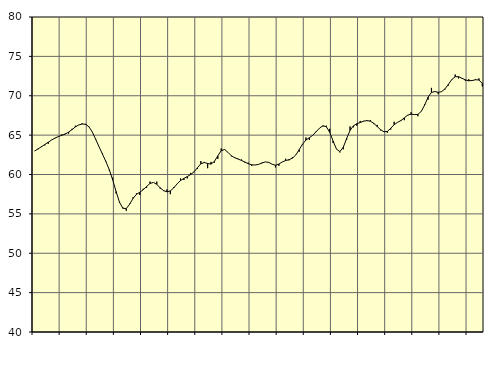
| Category | Piggar | Samtliga anställda (inkl. anställda utomlands) |
|---|---|---|
| nan | 63 | 62.98 |
| 87.0 | 63.2 | 63.26 |
| 87.0 | 63.6 | 63.53 |
| 87.0 | 63.7 | 63.81 |
| nan | 63.9 | 64.1 |
| 88.0 | 64.4 | 64.38 |
| 88.0 | 64.6 | 64.63 |
| 88.0 | 64.8 | 64.82 |
| nan | 65.1 | 64.98 |
| 89.0 | 65.2 | 65.13 |
| 89.0 | 65.2 | 65.38 |
| 89.0 | 65.8 | 65.7 |
| nan | 66.2 | 66.04 |
| 90.0 | 66.3 | 66.29 |
| 90.0 | 66.5 | 66.41 |
| 90.0 | 66.3 | 66.38 |
| nan | 66.1 | 66.06 |
| 91.0 | 65.4 | 65.39 |
| 91.0 | 64.4 | 64.46 |
| 91.0 | 63.5 | 63.5 |
| nan | 62.7 | 62.58 |
| 92.0 | 61.7 | 61.64 |
| 92.0 | 60.5 | 60.61 |
| 92.0 | 59.6 | 59.32 |
| nan | 57.6 | 57.84 |
| 93.0 | 56.4 | 56.49 |
| 93.0 | 55.8 | 55.71 |
| 93.0 | 55.4 | 55.68 |
| nan | 56.3 | 56.23 |
| 94.0 | 57.1 | 56.96 |
| 94.0 | 57.6 | 57.48 |
| 94.0 | 57.4 | 57.75 |
| nan | 58.2 | 58.06 |
| 95.0 | 58.3 | 58.47 |
| 95.0 | 59.1 | 58.86 |
| 95.0 | 59 | 58.99 |
| nan | 59.1 | 58.75 |
| 96.0 | 58.2 | 58.32 |
| 96.0 | 57.9 | 57.95 |
| 96.0 | 58.1 | 57.8 |
| nan | 57.5 | 57.92 |
| 97.0 | 58.4 | 58.29 |
| 97.0 | 58.8 | 58.81 |
| 97.0 | 59.5 | 59.23 |
| nan | 59.3 | 59.5 |
| 98.0 | 59.5 | 59.74 |
| 98.0 | 60.2 | 60 |
| 98.0 | 60.3 | 60.34 |
| nan | 60.7 | 60.86 |
| 99.0 | 61.7 | 61.36 |
| 99.0 | 61.6 | 61.52 |
| 99.0 | 60.8 | 61.4 |
| nan | 61.6 | 61.32 |
| 0.0 | 61.5 | 61.66 |
| 0.0 | 62 | 62.37 |
| 0.0 | 63.3 | 63.02 |
| nan | 63.2 | 63.18 |
| 1.0 | 62.8 | 62.81 |
| 1.0 | 62.3 | 62.38 |
| 1.0 | 62.2 | 62.13 |
| nan | 62 | 61.96 |
| 2.0 | 61.9 | 61.78 |
| 2.0 | 61.5 | 61.58 |
| 2.0 | 61.5 | 61.37 |
| nan | 61.1 | 61.23 |
| 3.0 | 61.2 | 61.21 |
| 3.0 | 61.3 | 61.28 |
| 3.0 | 61.5 | 61.45 |
| nan | 61.6 | 61.6 |
| 4.0 | 61.5 | 61.54 |
| 4.0 | 61.3 | 61.31 |
| 4.0 | 60.9 | 61.17 |
| nan | 61.1 | 61.32 |
| 5.0 | 61.6 | 61.59 |
| 5.0 | 62 | 61.77 |
| 5.0 | 61.8 | 61.88 |
| nan | 62.2 | 62.08 |
| 6.0 | 62.5 | 62.48 |
| 6.0 | 62.9 | 63.15 |
| 6.0 | 63.8 | 63.87 |
| nan | 64.7 | 64.38 |
| 7.0 | 64.4 | 64.67 |
| 7.0 | 65 | 64.98 |
| 7.0 | 65.5 | 65.44 |
| nan | 65.9 | 65.89 |
| 8.0 | 66.1 | 66.19 |
| 8.0 | 66.2 | 66.07 |
| 8.0 | 65.8 | 65.36 |
| nan | 64 | 64.25 |
| 9.0 | 63.2 | 63.22 |
| 9.0 | 62.8 | 62.91 |
| 9.0 | 63.2 | 63.46 |
| nan | 64.4 | 64.58 |
| 10.0 | 66.1 | 65.6 |
| 10.0 | 66 | 66.19 |
| 10.0 | 66.2 | 66.45 |
| nan | 66.8 | 66.6 |
| 11.0 | 66.8 | 66.77 |
| 11.0 | 66.8 | 66.84 |
| 11.0 | 66.9 | 66.77 |
| nan | 66.4 | 66.5 |
| 12.0 | 66.3 | 66.09 |
| 12.0 | 65.6 | 65.69 |
| 12.0 | 65.5 | 65.42 |
| nan | 65.3 | 65.47 |
| 13.0 | 65.7 | 65.87 |
| 13.0 | 66.7 | 66.32 |
| 13.0 | 66.6 | 66.62 |
| nan | 66.9 | 66.85 |
| 14.0 | 66.9 | 67.19 |
| 14.0 | 67.5 | 67.54 |
| 14.0 | 67.9 | 67.66 |
| nan | 67.6 | 67.61 |
| 15.0 | 67.4 | 67.63 |
| 15.0 | 68 | 68.02 |
| 15.0 | 68.9 | 68.82 |
| nan | 69.5 | 69.81 |
| 16.0 | 71 | 70.42 |
| 16.0 | 70.5 | 70.53 |
| 16.0 | 70.2 | 70.44 |
| nan | 70.5 | 70.52 |
| 17.0 | 70.8 | 70.87 |
| 17.0 | 71.3 | 71.44 |
| 17.0 | 72.1 | 72.06 |
| nan | 72.7 | 72.42 |
| 18.0 | 72.2 | 72.42 |
| 18.0 | 72.2 | 72.22 |
| 18.0 | 71.9 | 72.02 |
| nan | 72.1 | 71.9 |
| 19.0 | 72 | 71.93 |
| 19.0 | 72.1 | 72.03 |
| 19.0 | 72.2 | 72 |
| nan | 71.2 | 71.57 |